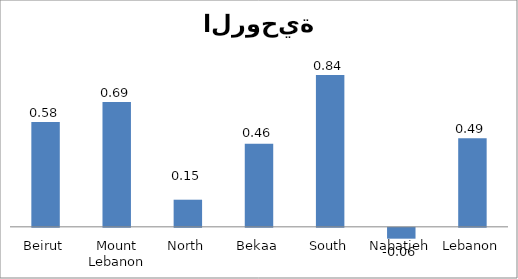
| Category | 01 |
|---|---|
| Beirut | 0.58 |
| Mount Lebanon | 0.69 |
| North | 0.15 |
| Bekaa | 0.46 |
| South | 0.84 |
| Nabatieh | -0.06 |
| Lebanon | 0.49 |